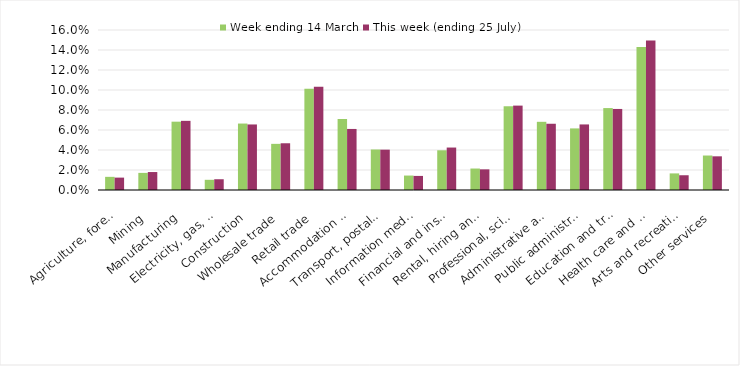
| Category | Week ending 14 March | This week (ending 25 July) |
|---|---|---|
| Agriculture, forestry and fishing | 0.013 | 0.012 |
| Mining | 0.017 | 0.018 |
| Manufacturing | 0.068 | 0.069 |
| Electricity, gas, water and waste services | 0.01 | 0.011 |
| Construction | 0.066 | 0.066 |
| Wholesale trade | 0.046 | 0.047 |
| Retail trade | 0.101 | 0.103 |
| Accommodation and food services | 0.071 | 0.061 |
| Transport, postal and warehousing | 0.041 | 0.04 |
| Information media and telecommunications | 0.014 | 0.014 |
| Financial and insurance services | 0.04 | 0.042 |
| Rental, hiring and real estate services | 0.021 | 0.021 |
| Professional, scientific and technical services | 0.084 | 0.084 |
| Administrative and support services | 0.068 | 0.066 |
| Public administration and safety | 0.062 | 0.066 |
| Education and training | 0.082 | 0.081 |
| Health care and social assistance | 0.143 | 0.149 |
| Arts and recreation services | 0.017 | 0.015 |
| Other services | 0.034 | 0.034 |